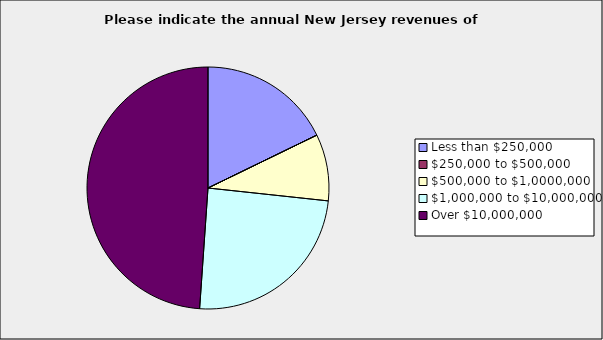
| Category | Series 0 |
|---|---|
| Less than $250,000 | 0.178 |
| $250,000 to $500,000 | 0 |
| $500,000 to $1,0000,000 | 0.089 |
| $1,000,000 to $10,000,000 | 0.244 |
| Over $10,000,000 | 0.489 |